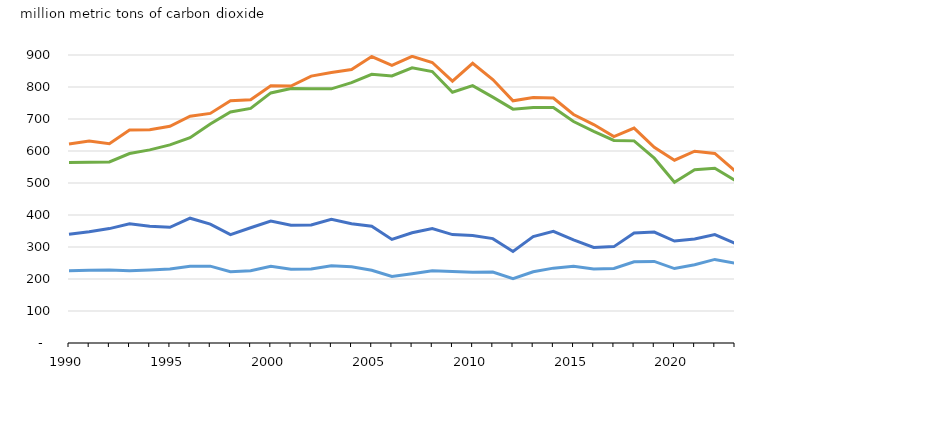
| Category | commercial direct use | commercial purchased electricity | residential direct use | residential purchased electricity |
|---|---|---|---|---|
| 1990 | 226.088 | 564.164 | 339.974 | 621.879 |
| 1991 | 227.18 | 564.926 | 347.67 | 631.095 |
| 1992 | 228.302 | 565.68 | 357.54 | 622.868 |
| 1993 | 225.54 | 591.99 | 372.782 | 665.615 |
| 1994 | 228.218 | 603.537 | 364.771 | 666.577 |
| 1995 | 231.156 | 619.035 | 361.589 | 677.089 |
| 1996 | 239.841 | 641.57 | 390.012 | 708.636 |
| 1997 | 240.078 | 684.636 | 371.692 | 717.483 |
| 1998 | 222.775 | 722.093 | 338.89 | 757.028 |
| 1999 | 225.644 | 733.139 | 360.12 | 760.438 |
| 2000 | 239.607 | 781.462 | 381.325 | 803.773 |
| 2001 | 230.515 | 795.444 | 368.129 | 802.852 |
| 2002 | 231.348 | 794.182 | 368.551 | 834.17 |
| 2003 | 241.564 | 794.304 | 386.315 | 845.389 |
| 2004 | 238.076 | 813.754 | 372.672 | 854.465 |
| 2005 | 227.308 | 839.805 | 365.181 | 895.228 |
| 2006 | 207.775 | 834.35 | 323.694 | 867.587 |
| 2007 | 216.744 | 859.867 | 344.347 | 895.853 |
| 2008 | 225.963 | 848.38 | 357.699 | 876.653 |
| 2009 | 223.207 | 783.554 | 338.713 | 818.273 |
| 2010 | 220.905 | 804.198 | 336.114 | 874.031 |
| 2011 | 221.789 | 768.421 | 326.176 | 823.241 |
| 2012 | 201.049 | 730.844 | 286.272 | 756.955 |
| 2013 | 222.721 | 735.621 | 332.52 | 767.384 |
| 2014 | 233.948 | 735.709 | 349.088 | 765.662 |
| 2015 | 239.575 | 692.087 | 322.391 | 714.132 |
| 2016 | 231.578 | 661.344 | 298.652 | 682.564 |
| 2017 | 232.997 | 633.179 | 301.194 | 645.235 |
| 2018 | 253.766 | 631.658 | 343.865 | 671.584 |
| 2019 | 254.861 | 577.594 | 346.662 | 611.299 |
| 2020 | 232.682 | 502.206 | 318.575 | 571.315 |
| 2021 | 244.749 | 541.428 | 324.941 | 599.322 |
| 2022 | 261.203 | 546.022 | 338.706 | 592.487 |
| 2023 | 249.689 | 508.104 | 311.212 | 537.574 |